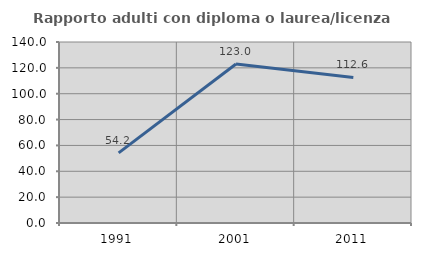
| Category | Rapporto adulti con diploma o laurea/licenza media  |
|---|---|
| 1991.0 | 54.22 |
| 2001.0 | 123.019 |
| 2011.0 | 112.571 |